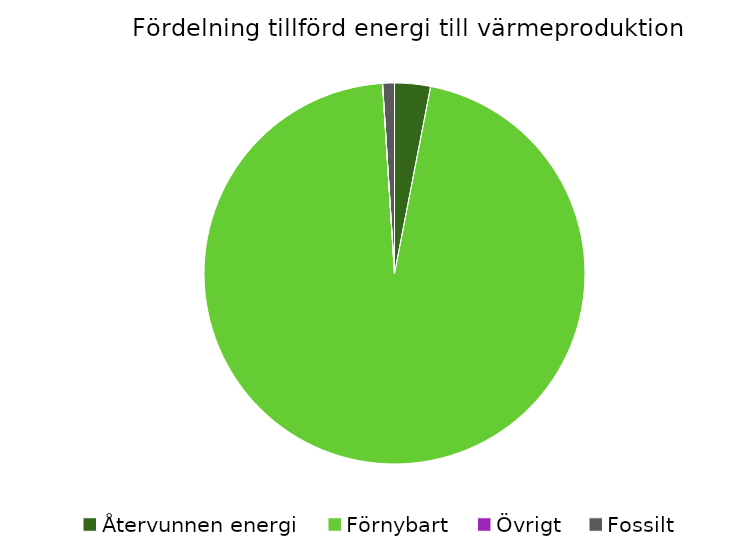
| Category | Fördelning värmeproduktion |
|---|---|
| Återvunnen energi | 0.03 |
| Förnybart | 0.96 |
| Övrigt | 0 |
| Fossilt | 0.01 |